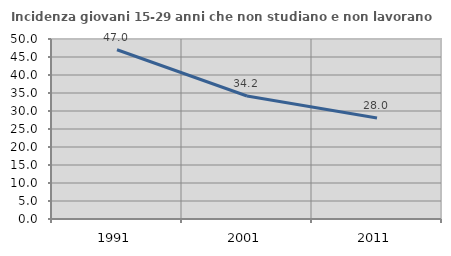
| Category | Incidenza giovani 15-29 anni che non studiano e non lavorano  |
|---|---|
| 1991.0 | 47.016 |
| 2001.0 | 34.158 |
| 2011.0 | 28.04 |